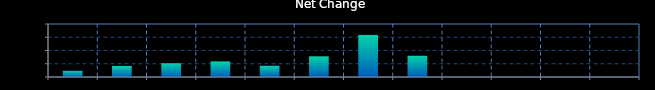
| Category | Series 0 |
|---|---|
| 0 | 0.002 |
| 1 | 0.004 |
| 2 | 0.005 |
| 3 | 0.006 |
| 4 | 0.004 |
| 5 | 0.008 |
| 6 | 0.016 |
| 7 | 0.008 |
| 8 | 0 |
| 9 | 0 |
| 10 | 0 |
| 11 | 0 |